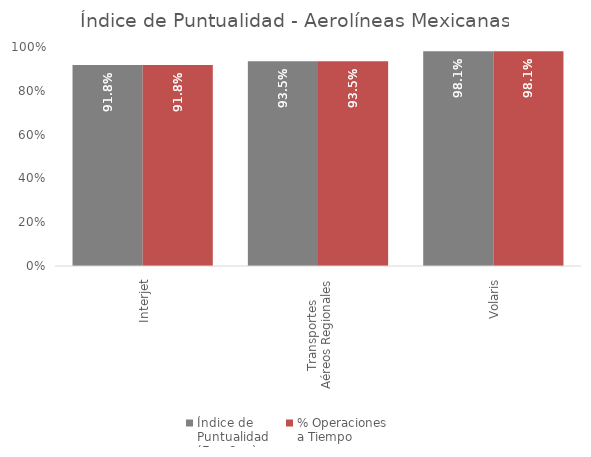
| Category | Índice de 
Puntualidad
(Ene-Sep) | % Operaciones 
a Tiempo |
|---|---|---|
| Interjet | 0.918 | 0.918 |
| Transportes 
Aéreos Regionales | 0.935 | 0.935 |
| Volaris | 0.981 | 0.981 |